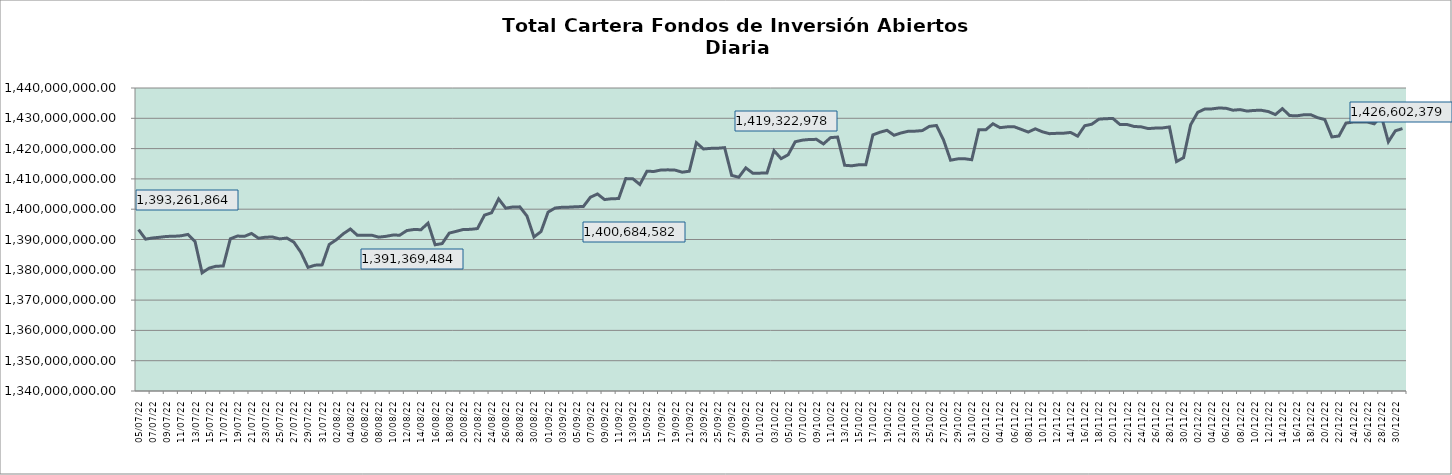
| Category | Cartera |
|---|---|
| 2022-07-05 | 1393261863.81 |
| 2022-07-06 | 1390116404.534 |
| 2022-07-07 | 1390510427.247 |
| 2022-07-08 | 1390734878.748 |
| 2022-07-09 | 1391020958.616 |
| 2022-07-10 | 1391057099.148 |
| 2022-07-11 | 1391218695.612 |
| 2022-07-12 | 1391675700.974 |
| 2022-07-13 | 1389358505.761 |
| 2022-07-14 | 1378992001.968 |
| 2022-07-15 | 1380557052.346 |
| 2022-07-16 | 1381195107.219 |
| 2022-07-17 | 1381231880.35 |
| 2022-07-18 | 1390229918.117 |
| 2022-07-19 | 1391135262.787 |
| 2022-07-20 | 1391047940.343 |
| 2022-07-21 | 1391992371.177 |
| 2022-07-22 | 1390406940.178 |
| 2022-07-23 | 1390769191.673 |
| 2022-07-24 | 1390805453.085 |
| 2022-07-25 | 1390194724.42 |
| 2022-07-26 | 1390487045.656 |
| 2022-07-27 | 1389122066.254 |
| 2022-07-28 | 1385730531.806 |
| 2022-07-29 | 1380788041.277 |
| 2022-07-30 | 1381528916.539 |
| 2022-07-31 | 1381624000.158 |
| 2022-08-01 | 1388336583.346 |
| 2022-08-02 | 1389897678.18 |
| 2022-08-03 | 1391884063.522 |
| 2022-08-04 | 1393467013.414 |
| 2022-08-05 | 1391369484.096 |
| 2022-08-06 | 1391403380.919 |
| 2022-08-07 | 1391439250.332 |
| 2022-08-08 | 1390779115.887 |
| 2022-08-09 | 1391027276.433 |
| 2022-08-10 | 1391453641.256 |
| 2022-08-11 | 1391436480.166 |
| 2022-08-12 | 1392952974.916 |
| 2022-08-13 | 1393297884.727 |
| 2022-08-14 | 1393236504.101 |
| 2022-08-15 | 1395404793.942 |
| 2022-08-16 | 1388259850.84 |
| 2022-08-17 | 1388646141.136 |
| 2022-08-18 | 1392107991.634 |
| 2022-08-19 | 1392698957.474 |
| 2022-08-20 | 1393311739.129 |
| 2022-08-21 | 1393347471.852 |
| 2022-08-22 | 1393606164.683 |
| 2022-08-23 | 1398044916.586 |
| 2022-08-24 | 1398815098.97 |
| 2022-08-25 | 1403397767.83 |
| 2022-08-26 | 1400337899.786 |
| 2022-08-27 | 1400732184.613 |
| 2022-08-28 | 1400771458.747 |
| 2022-08-29 | 1397785392.499 |
| 2022-08-30 | 1390833028.814 |
| 2022-08-31 | 1392615535.403 |
| 2022-09-01 | 1399039363.309 |
| 2022-09-02 | 1400392645.03 |
| 2022-09-03 | 1400645060.131 |
| 2022-09-04 | 1400684581.555 |
| 2022-09-05 | 1400817442.213 |
| 2022-09-06 | 1400891622.251 |
| 2022-09-07 | 1403958820.363 |
| 2022-09-08 | 1405023466.637 |
| 2022-09-09 | 1403175078.365 |
| 2022-09-10 | 1403461332.728 |
| 2022-09-11 | 1403504075.297 |
| 2022-09-12 | 1410097119.761 |
| 2022-09-13 | 1410053065.534 |
| 2022-09-14 | 1408160683.201 |
| 2022-09-15 | 1412524185.556 |
| 2022-09-16 | 1412455841.258 |
| 2022-09-17 | 1412949456.986 |
| 2022-09-18 | 1412985743.596 |
| 2022-09-19 | 1412893049.638 |
| 2022-09-20 | 1412211194.624 |
| 2022-09-21 | 1412538490.132 |
| 2022-09-22 | 1421948374.117 |
| 2022-09-23 | 1419880381.565 |
| 2022-09-24 | 1420072394.229 |
| 2022-09-25 | 1420112885.62 |
| 2022-09-26 | 1420321865.495 |
| 2022-09-27 | 1411167511.271 |
| 2022-09-28 | 1410545197.187 |
| 2022-09-29 | 1413642414.25 |
| 2022-09-30 | 1411870242.763 |
| 2022-10-01 | 1411900993.878 |
| 2022-10-02 | 1411943949.939 |
| 2022-10-03 | 1419322977.977 |
| 2022-10-04 | 1416681263.393 |
| 2022-10-05 | 1417958852.561 |
| 2022-10-06 | 1422252782.915 |
| 2022-10-07 | 1422786146.827 |
| 2022-10-08 | 1423011982.164 |
| 2022-10-09 | 1423053620.213 |
| 2022-10-10 | 1421543417.904 |
| 2022-10-11 | 1423617095.466 |
| 2022-10-12 | 1423808598.603 |
| 2022-10-13 | 1414496910.184 |
| 2022-10-14 | 1414328037.075 |
| 2022-10-15 | 1414661700.57 |
| 2022-10-16 | 1414704189.219 |
| 2022-10-17 | 1424522340.468 |
| 2022-10-18 | 1425398820.369 |
| 2022-10-19 | 1426045636.233 |
| 2022-10-20 | 1424386447.619 |
| 2022-10-21 | 1425165570.247 |
| 2022-10-22 | 1425721667.738 |
| 2022-10-23 | 1425758190.362 |
| 2022-10-24 | 1425947732.247 |
| 2022-10-25 | 1427336269.267 |
| 2022-10-26 | 1427632356.143 |
| 2022-10-27 | 1422877740.873 |
| 2022-10-28 | 1416169201.86 |
| 2022-10-29 | 1416607613.669 |
| 2022-10-30 | 1416650146.001 |
| 2022-10-31 | 1416331766.305 |
| 2022-11-01 | 1426192239.197 |
| 2022-11-02 | 1426226155.312 |
| 2022-11-03 | 1428197905.225 |
| 2022-11-04 | 1426912151.28 |
| 2022-11-05 | 1427171979.586 |
| 2022-11-06 | 1427213072.958 |
| 2022-11-07 | 1426353426.271 |
| 2022-11-08 | 1425459505.225 |
| 2022-11-09 | 1426531916.044 |
| 2022-11-10 | 1425548904.535 |
| 2022-11-11 | 1424927078.256 |
| 2022-11-12 | 1425034561.531 |
| 2022-11-13 | 1425076176.805 |
| 2022-11-14 | 1425332071.31 |
| 2022-11-15 | 1424113098.419 |
| 2022-11-16 | 1427543919.363 |
| 2022-11-17 | 1428048505.919 |
| 2022-11-18 | 1429705828.493 |
| 2022-11-19 | 1429879400.473 |
| 2022-11-20 | 1429920453.246 |
| 2022-11-21 | 1427934405.369 |
| 2022-11-22 | 1427949642.617 |
| 2022-11-23 | 1427301895.039 |
| 2022-11-24 | 1427187291.038 |
| 2022-11-25 | 1426602895.357 |
| 2022-11-26 | 1426773701.438 |
| 2022-11-27 | 1426813612.506 |
| 2022-11-28 | 1427146720.932 |
| 2022-11-29 | 1415715436.106 |
| 2022-11-30 | 1417010819.911 |
| 2022-12-01 | 1427862713.67 |
| 2022-12-02 | 1431963146.083 |
| 2022-12-03 | 1433060642.217 |
| 2022-12-04 | 1433102608.419 |
| 2022-12-05 | 1433404057.117 |
| 2022-12-06 | 1433317184.821 |
| 2022-12-07 | 1432670716.225 |
| 2022-12-08 | 1432870135.816 |
| 2022-12-09 | 1432380107.488 |
| 2022-12-10 | 1432604184.002 |
| 2022-12-11 | 1432646559.282 |
| 2022-12-12 | 1432229513.362 |
| 2022-12-13 | 1431228652.369 |
| 2022-12-14 | 1433198046.503 |
| 2022-12-15 | 1430917151.448 |
| 2022-12-16 | 1430808966.973 |
| 2022-12-17 | 1431148281.993 |
| 2022-12-18 | 1431192828.597 |
| 2022-12-19 | 1430190463.651 |
| 2022-12-20 | 1429591041.618 |
| 2022-12-21 | 1423850827.238 |
| 2022-12-22 | 1424157751.629 |
| 2022-12-23 | 1428429721.537 |
| 2022-12-24 | 1428754393.136 |
| 2022-12-25 | 1428801182.888 |
| 2022-12-26 | 1428772031.584 |
| 2022-12-27 | 1428186058.191 |
| 2022-12-28 | 1430784048.575 |
| 2022-12-29 | 1422245909.545 |
| 2022-12-30 | 1425874990.805 |
| 2022-12-31 | 1426602379.196 |